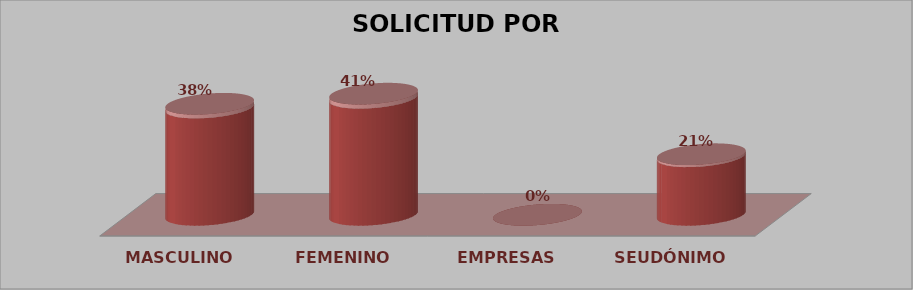
| Category | SOLICITUD POR GÉNERO | Series 1 |
|---|---|---|
| MASCULINO | 11 | 0.379 |
| FEMENINO | 12 | 0.414 |
| EMPRESAS | 0 | 0 |
| SEUDÓNIMO | 6 | 0.207 |